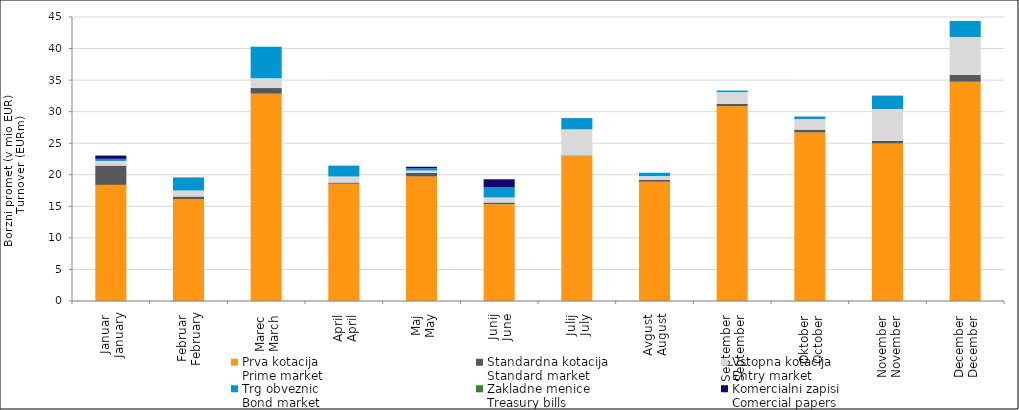
| Category | Prva kotacija
Prime market | Standardna kotacija
Standard market | Vstopna kotacija
Entry market | Trg obveznic
Bond market | Zakladne menice
Treasury bills | Komercialni zapisi
Comercial papers |
|---|---|---|---|---|---|---|
| Januar
January | 18.4 | 3.054 | 0.744 | 0.328 | 0 | 0.516 |
| Februar
February | 16.126 | 0.443 | 0.947 | 2.001 | 0 | 0.035 |
| Marec
March | 32.848 | 0.895 | 1.539 | 5.017 | 0 | 0 |
| April
April | 18.584 | 0.19 | 0.956 | 1.722 | 0 | 0 |
| Maj
May | 19.743 | 0.539 | 0.383 | 0.371 | 0 | 0.24 |
| Junij
June | 15.341 | 0.269 | 0.8 | 1.605 | 0 | 1.27 |
| Julij
July | 22.985 | 0.083 | 4.132 | 1.787 | 0 | 0 |
| Avgust
August | 18.908 | 0.25 | 0.651 | 0.514 | 0 | 0 |
| September
September | 30.895 | 0.316 | 1.892 | 0.239 | 0 | 0 |
| Oktober
October | 26.706 | 0.448 | 1.667 | 0.384 | 0 | 0.021 |
| November
November | 24.951 | 0.394 | 5.061 | 2.086 | 0 | 0.03 |
| December
December | 34.74 | 1.072 | 6.025 | 2.524 | 0 | 0.01 |